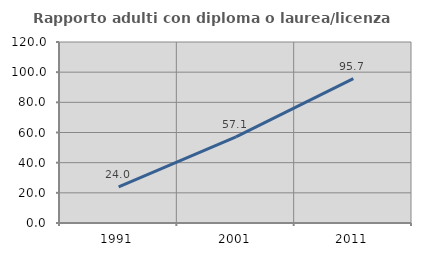
| Category | Rapporto adulti con diploma o laurea/licenza media  |
|---|---|
| 1991.0 | 24 |
| 2001.0 | 57.143 |
| 2011.0 | 95.699 |